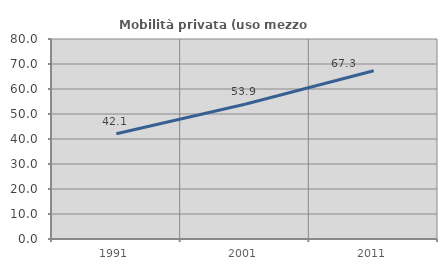
| Category | Mobilità privata (uso mezzo privato) |
|---|---|
| 1991.0 | 42.076 |
| 2001.0 | 53.872 |
| 2011.0 | 67.315 |